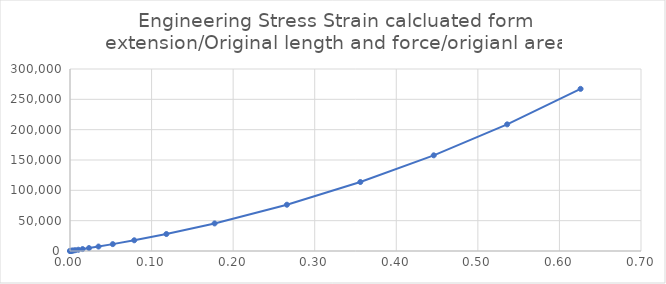
| Category | Series 0 |
|---|---|
| 9e-05 | 18.002 |
| 0.00018 | 36.01 |
| 0.000315 | 63.03 |
| 0.0005175 | 103.58 |
| 0.00082125 | 164.452 |
| 0.00127688 | 255.864 |
| 0.00196031 | 393.216 |
| 0.00298547 | 599.772 |
| 0.0045232 | 910.788 |
| 0.0068298 | 1379.988 |
| 0.0102897 | 2089.812 |
| 0.0154796 | 3168.168 |
| 0.0232643 | 4816.48 |
| 0.0349415 | 7358.84 |
| 0.0524573 | 11331.4 |
| 0.0787309 | 17654.56 |
| 0.118141 | 27980.36 |
| 0.177257 | 45434.4 |
| 0.265931 | 76282.4 |
| 0.355931 | 113701.2 |
| 0.445931 | 157710 |
| 0.535931 | 208745.6 |
| 0.625931 | 267246 |